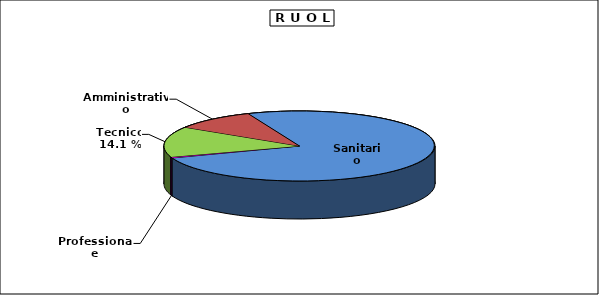
| Category | Personale |
|---|---|
| Professionale | 6 |
| Tecnico | 181 |
| Amministrativo | 126 |
| Sanitario | 972 |